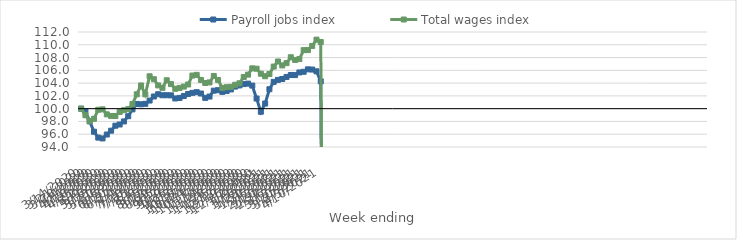
| Category | Payroll jobs index | Total wages index |
|---|---|---|
| 14/03/2020 | 100 | 100 |
| 21/03/2020 | 99.566 | 98.973 |
| 28/03/2020 | 98.027 | 98.032 |
| 04/04/2020 | 96.392 | 98.422 |
| 11/04/2020 | 95.469 | 99.832 |
| 18/04/2020 | 95.339 | 99.892 |
| 25/04/2020 | 95.952 | 99.111 |
| 02/05/2020 | 96.552 | 98.864 |
| 09/05/2020 | 97.331 | 98.845 |
| 16/05/2020 | 97.523 | 99.49 |
| 23/05/2020 | 98 | 99.757 |
| 30/05/2020 | 98.819 | 99.919 |
| 06/06/2020 | 99.892 | 100.736 |
| 13/06/2020 | 100.736 | 102.247 |
| 20/06/2020 | 100.684 | 103.631 |
| 27/06/2020 | 100.759 | 102.244 |
| 04/07/2020 | 101.272 | 105.071 |
| 11/07/2020 | 101.906 | 104.608 |
| 18/07/2020 | 102.259 | 103.641 |
| 25/07/2020 | 102.098 | 103.26 |
| 01/08/2020 | 102.102 | 104.445 |
| 08/08/2020 | 102.085 | 103.844 |
| 15/08/2020 | 101.597 | 103.111 |
| 22/08/2020 | 101.684 | 103.247 |
| 29/08/2020 | 101.977 | 103.455 |
| 05/09/2020 | 102.3 | 103.786 |
| 12/09/2020 | 102.476 | 105.185 |
| 19/09/2020 | 102.586 | 105.29 |
| 26/09/2020 | 102.375 | 104.498 |
| 03/10/2020 | 101.69 | 104.018 |
| 10/10/2020 | 101.894 | 104.109 |
| 17/10/2020 | 102.819 | 105.117 |
| 24/10/2020 | 102.891 | 104.494 |
| 31/10/2020 | 102.627 | 103.238 |
| 07/11/2020 | 102.77 | 103.363 |
| 14/11/2020 | 103.008 | 103.418 |
| 21/11/2020 | 103.457 | 103.742 |
| 28/11/2020 | 103.64 | 103.969 |
| 05/12/2020 | 103.846 | 104.966 |
| 12/12/2020 | 103.922 | 105.327 |
| 19/12/2020 | 103.612 | 106.313 |
| 26/12/2020 | 101.583 | 106.255 |
| 02/01/2021 | 99.516 | 105.47 |
| 09/01/2021 | 100.798 | 105.075 |
| 16/01/2021 | 103.041 | 105.43 |
| 23/01/2021 | 104.194 | 106.589 |
| 30/01/2021 | 104.508 | 107.386 |
| 06/02/2021 | 104.646 | 106.769 |
| 13/02/2021 | 104.966 | 107.129 |
| 20/02/2021 | 105.274 | 108.049 |
| 27/02/2021 | 105.257 | 107.628 |
| 06/03/2021 | 105.669 | 107.76 |
| 13/03/2021 | 105.773 | 109.157 |
| 20/03/2021 | 106.154 | 109.17 |
| 27/03/2021 | 106.121 | 109.816 |
| 03/04/2021 | 105.843 | 110.804 |
| 10/04/2021 | 104.273 | 110.43 |